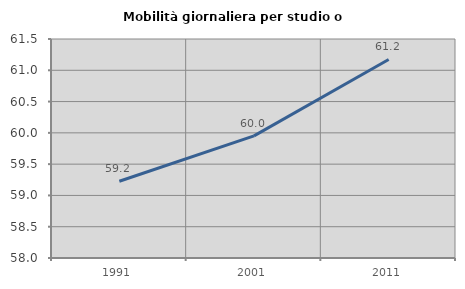
| Category | Mobilità giornaliera per studio o lavoro |
|---|---|
| 1991.0 | 59.227 |
| 2001.0 | 59.951 |
| 2011.0 | 61.173 |